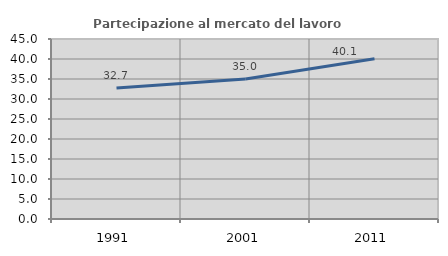
| Category | Partecipazione al mercato del lavoro  femminile |
|---|---|
| 1991.0 | 32.727 |
| 2001.0 | 34.984 |
| 2011.0 | 40.051 |